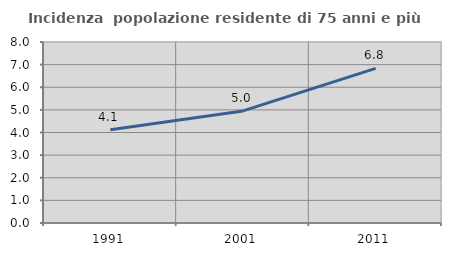
| Category | Incidenza  popolazione residente di 75 anni e più |
|---|---|
| 1991.0 | 4.124 |
| 2001.0 | 4.954 |
| 2011.0 | 6.834 |